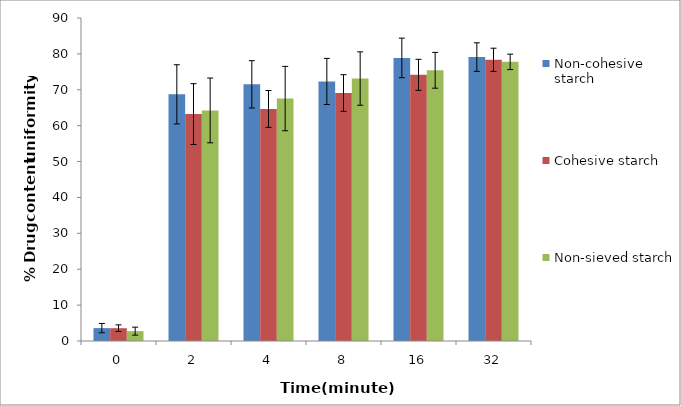
| Category | Non-cohesive starch  | Cohesive starch | Non-sieved starch |
|---|---|---|---|
| 0.0 | 3.595 | 3.567 | 2.747 |
| 2.0 | 68.726 | 63.223 | 64.247 |
| 4.0 | 71.513 | 64.667 | 67.553 |
| 8.0 | 72.323 | 69.1 | 73.123 |
| 16.0 | 78.88 | 74.167 | 75.43 |
| 32.0 | 79.104 | 78.35 | 77.777 |